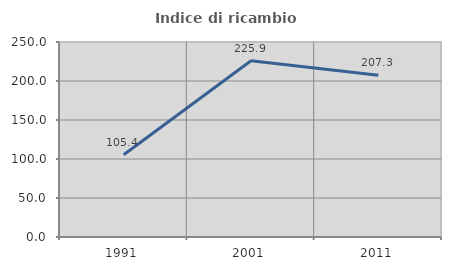
| Category | Indice di ricambio occupazionale  |
|---|---|
| 1991.0 | 105.405 |
| 2001.0 | 225.926 |
| 2011.0 | 207.317 |